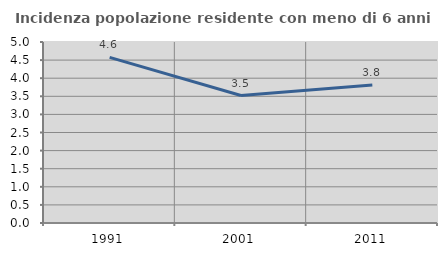
| Category | Incidenza popolazione residente con meno di 6 anni |
|---|---|
| 1991.0 | 4.575 |
| 2001.0 | 3.521 |
| 2011.0 | 3.81 |